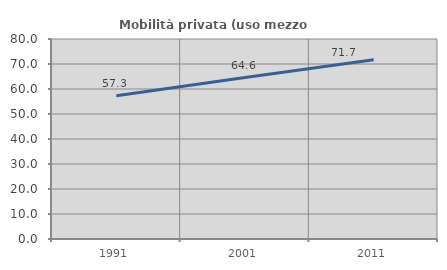
| Category | Mobilità privata (uso mezzo privato) |
|---|---|
| 1991.0 | 57.308 |
| 2001.0 | 64.561 |
| 2011.0 | 71.671 |